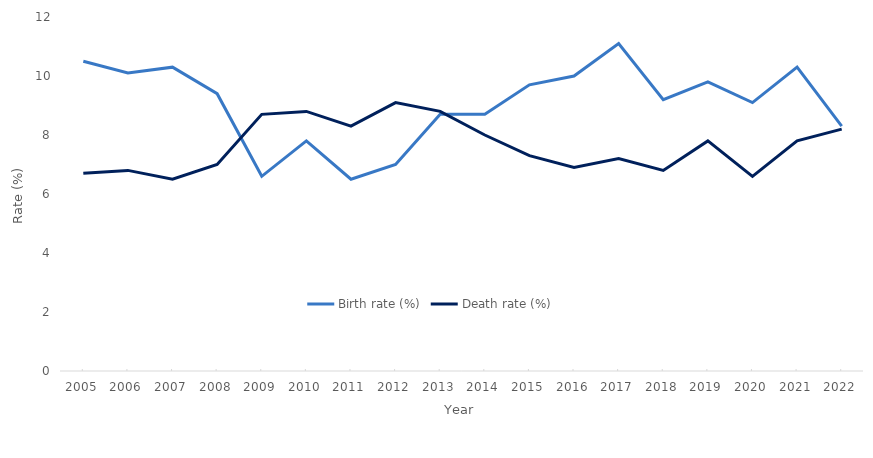
| Category | Birth rate (%) | Death rate (%) |
|---|---|---|
| 2005.0 | 10.5 | 6.7 |
| 2006.0 | 10.1 | 6.8 |
| 2007.0 | 10.3 | 6.5 |
| 2008.0 | 9.4 | 7 |
| 2009.0 | 6.6 | 8.7 |
| 2010.0 | 7.8 | 8.8 |
| 2011.0 | 6.5 | 8.3 |
| 2012.0 | 7 | 9.1 |
| 2013.0 | 8.7 | 8.8 |
| 2014.0 | 8.7 | 8 |
| 2015.0 | 9.7 | 7.3 |
| 2016.0 | 10 | 6.9 |
| 2017.0 | 11.1 | 7.2 |
| 2018.0 | 9.2 | 6.8 |
| 2019.0 | 9.8 | 7.8 |
| 2020.0 | 9.1 | 6.6 |
| 2021.0 | 10.3 | 7.8 |
| 2022.0 | 8.3 | 8.2 |